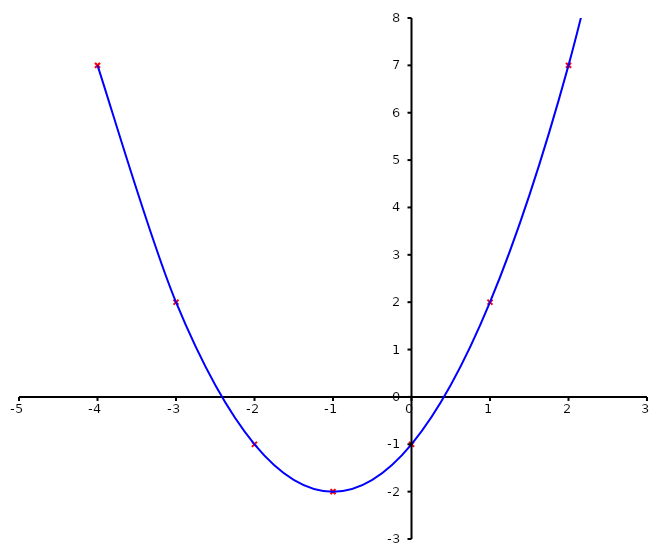
| Category | Series 0 |
|---|---|
| -4.0 | 7 |
| -3.0 | 2 |
| -2.0 | -1 |
| -1.0 | -2 |
| 0.0 | -1 |
| 1.0 | 2 |
| 2.0 | 7 |
| 3.0 | 14 |